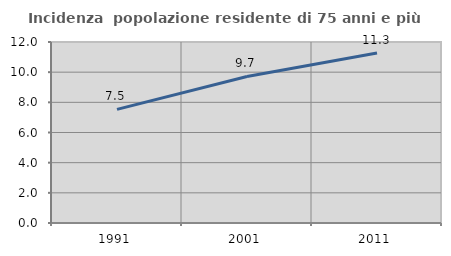
| Category | Incidenza  popolazione residente di 75 anni e più |
|---|---|
| 1991.0 | 7.532 |
| 2001.0 | 9.713 |
| 2011.0 | 11.267 |